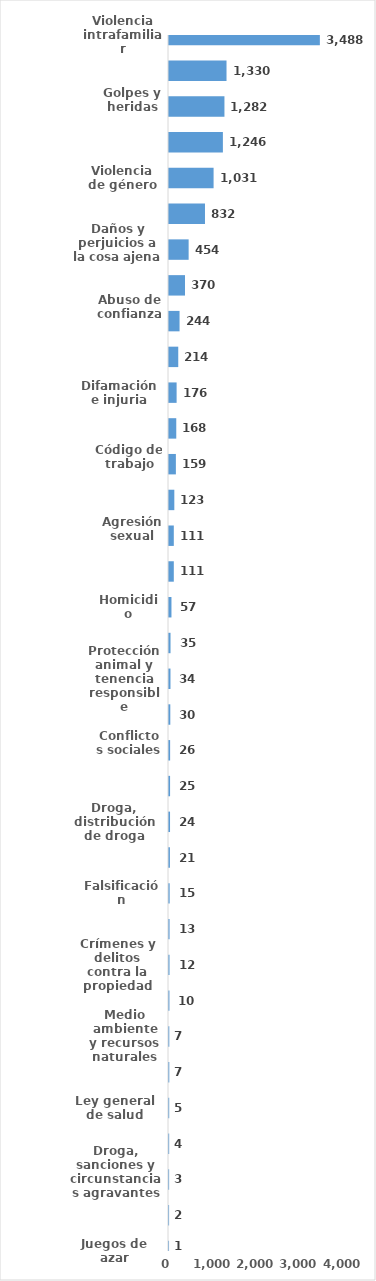
| Category | Series 0 |
|---|---|
| Violencia intrafamiliar | 3488 |
| Robo calificado | 1330 |
| Golpes y heridas | 1282 |
| Amenaza | 1246 |
| Violencia de género | 1031 |
| Código del menor NNA | 832 |
| Daños y perjuicios a la cosa ajena | 454 |
| Crímenes y delitos de alta tecnología | 370 |
| Abuso de confianza | 244 |
| Droga, simple posesión | 214 |
| Difamación e injuria | 176 |
| Asociación de malhechores | 168 |
| Código de trabajo | 159 |
| Ley de armas | 123 |
| Agresión sexual | 111 |
| Estafa | 111 |
| Homicidio | 57 |
| Violación sexual | 35 |
| Protección animal y tenencia responsible | 34 |
| Tentativa de homicidio | 30 |
| Conflictos sociales | 26 |
| Droga, traficante de droga | 25 |
| Droga, distribución de droga | 24 |
| Propiedad industrial, intelectual y derecho de autor | 21 |
| Falsificación | 15 |
| Robo simple | 13 |
| Crímenes y delitos contra la propiedad | 12 |
| Ley de cheque | 10 |
| Medio ambiente y recursos naturales | 7 |
| Pérdida de documento de identidad | 7 |
| Ley general de salud | 5 |
| Desaparición | 4 |
| Droga, sanciones y circunstancias agravantes | 3 |
| Secuestro | 2 |
| Juegos de azar | 1 |